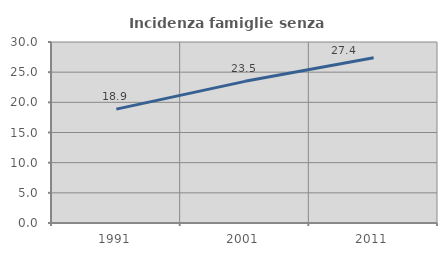
| Category | Incidenza famiglie senza nuclei |
|---|---|
| 1991.0 | 18.876 |
| 2001.0 | 23.479 |
| 2011.0 | 27.375 |